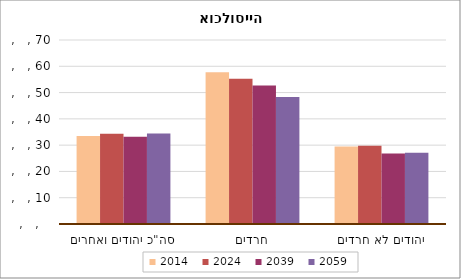
| Category | 2014 | 2024 | 2039 | 2059 |
|---|---|---|---|---|
| סה"כ יהודים ואחרים | 33.465 | 34.295 | 33.206 | 34.458 |
| חרדים | 57.705 | 55.211 | 52.677 | 48.357 |
| יהודים לא חרדים | 29.495 | 29.745 | 26.805 | 27.109 |